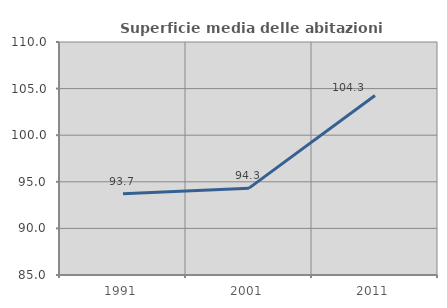
| Category | Superficie media delle abitazioni occupate |
|---|---|
| 1991.0 | 93.719 |
| 2001.0 | 94.317 |
| 2011.0 | 104.266 |